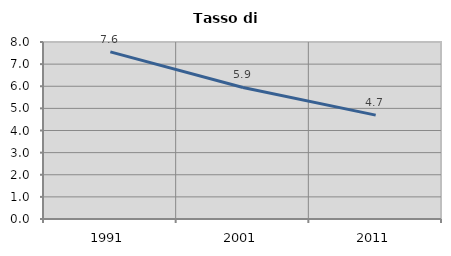
| Category | Tasso di disoccupazione   |
|---|---|
| 1991.0 | 7.554 |
| 2001.0 | 5.945 |
| 2011.0 | 4.696 |